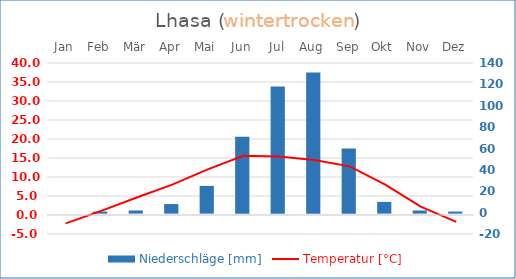
| Category | Niederschläge [mm] |
|---|---|
| Jan | 0 |
| Feb | 1 |
| Mär | 2 |
| Apr | 8 |
| Mai | 25 |
| Jun | 71 |
| Jul | 118 |
| Aug | 131 |
| Sep | 60 |
| Okt | 10 |
| Nov | 2 |
| Dez | 1 |